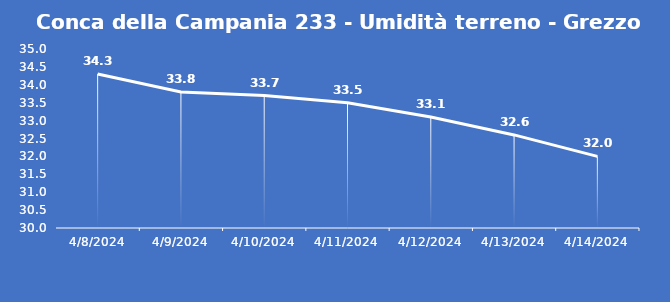
| Category | Conca della Campania 233 - Umidità terreno - Grezzo (%VWC) |
|---|---|
| 4/8/24 | 34.3 |
| 4/9/24 | 33.8 |
| 4/10/24 | 33.7 |
| 4/11/24 | 33.5 |
| 4/12/24 | 33.1 |
| 4/13/24 | 32.6 |
| 4/14/24 | 32 |